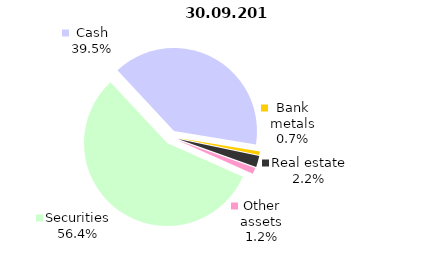
| Category | Total |
|---|---|
| Securities | 749.702 |
| Cash | 525.247 |
| Bank metals | 9.387 |
| Real estate | 28.673 |
| Other assets | 16.122 |